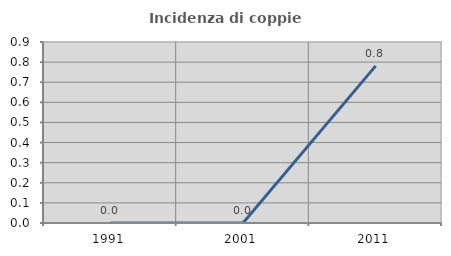
| Category | Incidenza di coppie miste |
|---|---|
| 1991.0 | 0 |
| 2001.0 | 0 |
| 2011.0 | 0.781 |